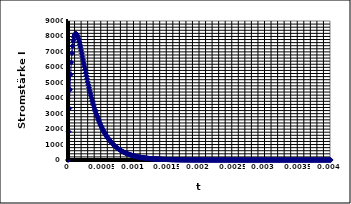
| Category | Series 0 |
|---|---|
| 0.0 | 0 |
| 1e-05 | 1835 |
| 2e-05 | 3338.369 |
| 3.0000000000000004e-05 | 4559.439 |
| 4e-05 | 5540.54 |
| 5e-05 | 6317.987 |
| 6e-05 | 6922.914 |
| 7.000000000000001e-05 | 7382.01 |
| 8e-05 | 7718.133 |
| 9e-05 | 7950.855 |
| 0.0001 | 8096.922 |
| 0.00011 | 8170.649 |
| 0.00012 | 8184.266 |
| 0.00013000000000000002 | 8148.21 |
| 0.00014000000000000001 | 8071.38 |
| 0.00015000000000000001 | 7961.353 |
| 0.00016 | 7824.573 |
| 0.00017 | 7666.509 |
| 0.00018 | 7491.8 |
| 0.00019 | 7304.367 |
| 0.0002 | 7107.518 |
| 0.00021 | 6904.039 |
| 0.00022 | 6696.264 |
| 0.00023 | 6486.147 |
| 0.00024 | 6275.311 |
| 0.00025 | 6065.1 |
| 0.00026000000000000003 | 5856.619 |
| 0.00027000000000000006 | 5650.771 |
| 0.0002800000000000001 | 5448.283 |
| 0.0002900000000000001 | 5249.739 |
| 0.00030000000000000014 | 5055.596 |
| 0.00031000000000000016 | 4866.205 |
| 0.0003200000000000002 | 4681.83 |
| 0.0003300000000000002 | 4502.658 |
| 0.00034000000000000024 | 4328.814 |
| 0.00035000000000000027 | 4160.371 |
| 0.0003600000000000003 | 3997.357 |
| 0.0003700000000000003 | 3839.764 |
| 0.00038000000000000035 | 3687.554 |
| 0.00039000000000000037 | 3540.666 |
| 0.0004000000000000004 | 3399.017 |
| 0.0004100000000000004 | 3262.508 |
| 0.00042000000000000045 | 3131.03 |
| 0.0004300000000000005 | 3004.462 |
| 0.0004400000000000005 | 2882.676 |
| 0.00045000000000000053 | 2765.54 |
| 0.00046000000000000056 | 2652.916 |
| 0.0004700000000000006 | 2544.666 |
| 0.0004800000000000006 | 2440.651 |
| 0.0004900000000000006 | 2340.73 |
| 0.0005000000000000007 | 2244.765 |
| 0.0005100000000000007 | 2152.618 |
| 0.0005200000000000007 | 2064.154 |
| 0.0005300000000000007 | 1979.239 |
| 0.0005400000000000008 | 1897.743 |
| 0.0005500000000000008 | 1819.539 |
| 0.0005600000000000008 | 1744.503 |
| 0.0005700000000000008 | 1672.514 |
| 0.0005800000000000009 | 1603.455 |
| 0.0005900000000000009 | 1537.213 |
| 0.0006000000000000009 | 1473.677 |
| 0.000610000000000001 | 1412.742 |
| 0.000620000000000001 | 1354.304 |
| 0.000630000000000001 | 1298.264 |
| 0.000640000000000001 | 1244.526 |
| 0.0006500000000000011 | 1192.999 |
| 0.0006600000000000011 | 1143.592 |
| 0.0006700000000000011 | 1096.221 |
| 0.0006800000000000011 | 1050.804 |
| 0.0006900000000000012 | 1007.26 |
| 0.0007000000000000012 | 965.514 |
| 0.0007100000000000012 | 925.493 |
| 0.0007200000000000012 | 887.125 |
| 0.0007300000000000013 | 850.344 |
| 0.0007400000000000013 | 815.084 |
| 0.0007500000000000013 | 781.282 |
| 0.0007600000000000013 | 748.88 |
| 0.0007700000000000014 | 717.82 |
| 0.0007800000000000014 | 688.045 |
| 0.0007900000000000014 | 659.504 |
| 0.0008000000000000014 | 632.145 |
| 0.0008100000000000015 | 605.92 |
| 0.0008200000000000015 | 580.782 |
| 0.0008300000000000015 | 556.686 |
| 0.0008400000000000016 | 533.589 |
| 0.0008500000000000016 | 511.449 |
| 0.0008600000000000016 | 490.227 |
| 0.0008700000000000016 | 469.886 |
| 0.0008800000000000017 | 450.388 |
| 0.0008900000000000017 | 431.698 |
| 0.0009000000000000017 | 413.784 |
| 0.0009100000000000017 | 396.613 |
| 0.0009200000000000018 | 380.154 |
| 0.0009300000000000018 | 364.378 |
| 0.0009400000000000018 | 349.257 |
| 0.0009500000000000018 | 334.763 |
| 0.0009600000000000019 | 320.87 |
| 0.0009700000000000019 | 307.554 |
| 0.000980000000000002 | 294.79 |
| 0.000990000000000002 | 282.556 |
| 0.001000000000000002 | 270.83 |
| 0.001010000000000002 | 259.59 |
| 0.001020000000000002 | 248.816 |
| 0.001030000000000002 | 238.49 |
| 0.001040000000000002 | 228.592 |
| 0.001050000000000002 | 219.105 |
| 0.0010600000000000021 | 210.012 |
| 0.0010700000000000022 | 201.295 |
| 0.0010800000000000022 | 192.941 |
| 0.0010900000000000022 | 184.934 |
| 0.0011000000000000022 | 177.258 |
| 0.0011100000000000023 | 169.902 |
| 0.0011200000000000023 | 162.85 |
| 0.0011300000000000023 | 156.091 |
| 0.0011400000000000023 | 149.613 |
| 0.0011500000000000024 | 143.404 |
| 0.0011600000000000024 | 137.452 |
| 0.0011700000000000024 | 131.747 |
| 0.0011800000000000024 | 126.279 |
| 0.0011900000000000025 | 121.038 |
| 0.0012000000000000025 | 116.015 |
| 0.0012100000000000025 | 111.2 |
| 0.0012200000000000025 | 106.584 |
| 0.0012300000000000026 | 102.161 |
| 0.0012400000000000026 | 97.921 |
| 0.0012500000000000026 | 93.857 |
| 0.0012600000000000027 | 89.961 |
| 0.0012700000000000027 | 86.228 |
| 0.0012800000000000027 | 82.649 |
| 0.0012900000000000027 | 79.219 |
| 0.0013000000000000028 | 75.931 |
| 0.0013100000000000028 | 72.779 |
| 0.0013200000000000028 | 69.759 |
| 0.0013300000000000028 | 66.864 |
| 0.0013400000000000029 | 64.088 |
| 0.0013500000000000029 | 61.429 |
| 0.001360000000000003 | 58.879 |
| 0.001370000000000003 | 56.435 |
| 0.001380000000000003 | 54.093 |
| 0.001390000000000003 | 51.848 |
| 0.001400000000000003 | 49.696 |
| 0.001410000000000003 | 47.634 |
| 0.001420000000000003 | 45.657 |
| 0.001430000000000003 | 43.762 |
| 0.0014400000000000031 | 41.945 |
| 0.0014500000000000032 | 40.204 |
| 0.0014600000000000032 | 38.536 |
| 0.0014700000000000032 | 36.936 |
| 0.0014800000000000032 | 35.403 |
| 0.0014900000000000033 | 33.934 |
| 0.0015000000000000033 | 32.526 |
| 0.0015100000000000033 | 31.176 |
| 0.0015200000000000033 | 29.882 |
| 0.0015300000000000034 | 28.642 |
| 0.0015400000000000034 | 27.453 |
| 0.0015500000000000034 | 26.314 |
| 0.0015600000000000034 | 25.221 |
| 0.0015700000000000035 | 24.175 |
| 0.0015800000000000035 | 23.171 |
| 0.0015900000000000035 | 22.21 |
| 0.0016000000000000035 | 21.288 |
| 0.0016100000000000036 | 20.404 |
| 0.0016200000000000036 | 19.557 |
| 0.0016300000000000036 | 18.746 |
| 0.0016400000000000037 | 17.968 |
| 0.0016500000000000037 | 17.222 |
| 0.0016600000000000037 | 16.507 |
| 0.0016700000000000037 | 15.822 |
| 0.0016800000000000038 | 15.165 |
| 0.0016900000000000038 | 14.536 |
| 0.0017000000000000038 | 13.933 |
| 0.0017100000000000038 | 13.354 |
| 0.0017200000000000039 | 12.8 |
| 0.0017300000000000039 | 12.269 |
| 0.001740000000000004 | 11.76 |
| 0.001750000000000004 | 11.272 |
| 0.001760000000000004 | 10.804 |
| 0.001770000000000004 | 10.355 |
| 0.001780000000000004 | 9.926 |
| 0.001790000000000004 | 9.514 |
| 0.001800000000000004 | 9.119 |
| 0.001810000000000004 | 8.74 |
| 0.0018200000000000041 | 8.378 |
| 0.0018300000000000041 | 8.03 |
| 0.0018400000000000042 | 7.697 |
| 0.0018500000000000042 | 7.377 |
| 0.0018600000000000042 | 7.071 |
| 0.0018700000000000043 | 6.778 |
| 0.0018800000000000043 | 6.496 |
| 0.0018900000000000043 | 6.227 |
| 0.0019000000000000043 | 5.968 |
| 0.0019100000000000044 | 5.721 |
| 0.0019200000000000044 | 5.483 |
| 0.0019300000000000044 | 5.256 |
| 0.0019400000000000044 | 5.037 |
| 0.0019500000000000045 | 4.828 |
| 0.0019600000000000043 | 4.628 |
| 0.0019700000000000043 | 4.436 |
| 0.0019800000000000043 | 4.252 |
| 0.0019900000000000044 | 4.075 |
| 0.0020000000000000044 | 3.906 |
| 0.0020100000000000044 | 3.744 |
| 0.0020200000000000044 | 3.589 |
| 0.0020300000000000045 | 3.44 |
| 0.0020400000000000045 | 3.297 |
| 0.0020500000000000045 | 3.16 |
| 0.0020600000000000045 | 3.029 |
| 0.0020700000000000046 | 2.903 |
| 0.0020800000000000046 | 2.783 |
| 0.0020900000000000046 | 2.667 |
| 0.0021000000000000046 | 2.557 |
| 0.0021100000000000047 | 2.45 |
| 0.0021200000000000047 | 2.349 |
| 0.0021300000000000047 | 2.251 |
| 0.0021400000000000047 | 2.158 |
| 0.0021500000000000048 | 2.068 |
| 0.002160000000000005 | 1.982 |
| 0.002170000000000005 | 1.9 |
| 0.002180000000000005 | 1.821 |
| 0.002190000000000005 | 1.746 |
| 0.002200000000000005 | 1.673 |
| 0.002210000000000005 | 1.604 |
| 0.002220000000000005 | 1.537 |
| 0.002230000000000005 | 1.473 |
| 0.002240000000000005 | 1.412 |
| 0.002250000000000005 | 1.354 |
| 0.002260000000000005 | 1.297 |
| 0.002270000000000005 | 1.244 |
| 0.002280000000000005 | 1.192 |
| 0.002290000000000005 | 1.143 |
| 0.002300000000000005 | 1.095 |
| 0.002310000000000005 | 1.05 |
| 0.0023200000000000052 | 1.006 |
| 0.0023300000000000052 | 0.964 |
| 0.0023400000000000053 | 0.924 |
| 0.0023500000000000053 | 0.886 |
| 0.0023600000000000053 | 0.849 |
| 0.0023700000000000053 | 0.814 |
| 0.0023800000000000054 | 0.78 |
| 0.0023900000000000054 | 0.748 |
| 0.0024000000000000054 | 0.717 |
| 0.0024100000000000055 | 0.687 |
| 0.0024200000000000055 | 0.658 |
| 0.0024300000000000055 | 0.631 |
| 0.0024400000000000055 | 0.605 |
| 0.0024500000000000056 | 0.58 |
| 0.0024600000000000056 | 0.556 |
| 0.0024700000000000056 | 0.533 |
| 0.0024800000000000056 | 0.511 |
| 0.0024900000000000057 | 0.489 |
| 0.0025000000000000057 | 0.469 |
| 0.0025100000000000057 | 0.45 |
| 0.0025200000000000057 | 0.431 |
| 0.0025300000000000058 | 0.413 |
| 0.002540000000000006 | 0.396 |
| 0.002550000000000006 | 0.38 |
| 0.002560000000000006 | 0.364 |
| 0.002570000000000006 | 0.349 |
| 0.002580000000000006 | 0.334 |
| 0.002590000000000006 | 0.32 |
| 0.002600000000000006 | 0.307 |
| 0.002610000000000006 | 0.294 |
| 0.002620000000000006 | 0.282 |
| 0.002630000000000006 | 0.27 |
| 0.002640000000000006 | 0.259 |
| 0.002650000000000006 | 0.248 |
| 0.002660000000000006 | 0.238 |
| 0.002670000000000006 | 0.228 |
| 0.002680000000000006 | 0.219 |
| 0.002690000000000006 | 0.21 |
| 0.002700000000000006 | 0.201 |
| 0.0027100000000000062 | 0.193 |
| 0.0027200000000000063 | 0.185 |
| 0.0027300000000000063 | 0.177 |
| 0.0027400000000000063 | 0.17 |
| 0.0027500000000000063 | 0.163 |
| 0.0027600000000000064 | 0.156 |
| 0.0027700000000000064 | 0.149 |
| 0.0027800000000000064 | 0.143 |
| 0.0027900000000000065 | 0.137 |
| 0.0028000000000000065 | 0.132 |
| 0.0028100000000000065 | 0.126 |
| 0.0028200000000000065 | 0.121 |
| 0.0028300000000000066 | 0.116 |
| 0.0028400000000000066 | 0.111 |
| 0.0028500000000000066 | 0.106 |
| 0.0028600000000000066 | 0.102 |
| 0.0028700000000000067 | 0.098 |
| 0.0028800000000000067 | 0.094 |
| 0.0028900000000000067 | 0.09 |
| 0.0029000000000000067 | 0.086 |
| 0.0029100000000000068 | 0.083 |
| 0.002920000000000007 | 0.079 |
| 0.002930000000000007 | 0.076 |
| 0.002940000000000007 | 0.073 |
| 0.002950000000000007 | 0.07 |
| 0.002960000000000007 | 0.067 |
| 0.002970000000000007 | 0.064 |
| 0.002980000000000007 | 0.061 |
| 0.002990000000000007 | 0.059 |
| 0.003000000000000007 | 0.056 |
| 0.003010000000000007 | 0.054 |
| 0.003020000000000007 | 0.052 |
| 0.003030000000000007 | 0.05 |
| 0.003040000000000007 | 0.048 |
| 0.003050000000000007 | 0.046 |
| 0.003060000000000007 | 0.044 |
| 0.003070000000000007 | 0.042 |
| 0.003080000000000007 | 0.04 |
| 0.0030900000000000072 | 0.038 |
| 0.0031000000000000073 | 0.037 |
| 0.0031100000000000073 | 0.035 |
| 0.0031200000000000073 | 0.034 |
| 0.0031300000000000073 | 0.032 |
| 0.0031400000000000074 | 0.031 |
| 0.0031500000000000074 | 0.03 |
| 0.0031600000000000074 | 0.029 |
| 0.0031700000000000074 | 0.027 |
| 0.0031800000000000075 | 0.026 |
| 0.0031900000000000075 | 0.025 |
| 0.0032000000000000075 | 0.024 |
| 0.0032100000000000076 | 0.023 |
| 0.0032200000000000076 | 0.022 |
| 0.0032300000000000076 | 0.021 |
| 0.0032400000000000076 | 0.02 |
| 0.0032500000000000077 | 0.02 |
| 0.0032600000000000077 | 0.019 |
| 0.0032700000000000077 | 0.018 |
| 0.0032800000000000077 | 0.017 |
| 0.0032900000000000078 | 0.016 |
| 0.003300000000000008 | 0.016 |
| 0.003310000000000008 | 0.015 |
| 0.003320000000000008 | 0.015 |
| 0.003330000000000008 | 0.014 |
| 0.003340000000000008 | 0.013 |
| 0.003350000000000008 | 0.013 |
| 0.003360000000000008 | 0.012 |
| 0.003370000000000008 | 0.012 |
| 0.003380000000000008 | 0.011 |
| 0.003390000000000008 | 0.011 |
| 0.003400000000000008 | 0.01 |
| 0.003410000000000008 | 0.01 |
| 0.003420000000000008 | 0.009 |
| 0.003430000000000008 | 0.009 |
| 0.003440000000000008 | 0.009 |
| 0.003450000000000008 | 0.008 |
| 0.003460000000000008 | 0.008 |
| 0.0034700000000000082 | 0.008 |
| 0.0034800000000000083 | 0.007 |
| 0.0034900000000000083 | 0.007 |
| 0.0035000000000000083 | 0.007 |
| 0.0035100000000000083 | 0.006 |
| 0.0035200000000000084 | 0.006 |
| 0.0035300000000000084 | 0.006 |
| 0.0035400000000000084 | 0.006 |
| 0.0035500000000000084 | 0.005 |
| 0.0035600000000000085 | 0.005 |
| 0.0035700000000000085 | 0.005 |
| 0.0035800000000000085 | 0.005 |
| 0.0035900000000000085 | 0.005 |
| 0.0036000000000000086 | 0.004 |
| 0.0036100000000000086 | 0.004 |
| 0.0036200000000000086 | 0.004 |
| 0.0036300000000000087 | 0.004 |
| 0.0036400000000000087 | 0.004 |
| 0.0036500000000000087 | 0.004 |
| 0.0036600000000000087 | 0.003 |
| 0.0036700000000000088 | 0.003 |
| 0.003680000000000009 | 0.003 |
| 0.003690000000000009 | 0.003 |
| 0.003700000000000009 | 0.003 |
| 0.003710000000000009 | 0.003 |
| 0.003720000000000009 | 0.003 |
| 0.003730000000000009 | 0.003 |
| 0.003740000000000009 | 0.002 |
| 0.003750000000000009 | 0.002 |
| 0.003760000000000009 | 0.002 |
| 0.003770000000000009 | 0.002 |
| 0.003780000000000009 | 0.002 |
| 0.003790000000000009 | 0.002 |
| 0.003800000000000009 | 0.002 |
| 0.003810000000000009 | 0.002 |
| 0.003820000000000009 | 0.002 |
| 0.003830000000000009 | 0.002 |
| 0.003840000000000009 | 0.002 |
| 0.0038500000000000092 | 0.002 |
| 0.0038600000000000093 | 0.001 |
| 0.0038700000000000093 | 0.001 |
| 0.0038800000000000093 | 0.001 |
| 0.0038900000000000093 | 0.001 |
| 0.0039000000000000094 | 0.001 |
| 0.003910000000000009 | 0.001 |
| 0.0039200000000000085 | 0.001 |
| 0.003930000000000008 | 0.001 |
| 0.003940000000000008 | 0.001 |
| 0.003950000000000007 | 0.001 |
| 0.003960000000000007 | 0.001 |
| 0.0039700000000000065 | 0.001 |
| 0.003980000000000006 | 0.001 |
| 0.003990000000000006 | 0.001 |
| 0.004000000000000005 | 0.001 |
| 0.004010000000000005 | 0.001 |
| 0.0040200000000000045 | 0.001 |
| 0.004030000000000004 | 0.001 |
| 0.004040000000000004 | 0.001 |
| 0.004050000000000003 | 0.001 |
| 0.004060000000000003 | 0.001 |
| 0.0040700000000000024 | 0.001 |
| 0.004080000000000002 | 0.001 |
| 0.004090000000000002 | 0.001 |
| 0.004100000000000001 | 0.001 |
| 0.004110000000000001 | 0.001 |
| 0.00412 | 0 |
| 0.00413 | 0 |
| 0.00414 | 0 |
| 0.004149999999999999 | 0 |
| 0.004159999999999999 | 0 |
| 0.004169999999999998 | 0 |
| 0.004179999999999998 | 0 |
| 0.0041899999999999975 | 0 |
| 0.004199999999999997 | 0 |
| 0.004209999999999997 | 0 |
| 0.004219999999999996 | 0 |
| 0.004229999999999996 | 0 |
| 0.0042399999999999955 | 0 |
| 0.004249999999999995 | 0 |
| 0.004259999999999995 | 0 |
| 0.004269999999999994 | 0 |
| 0.004279999999999994 | 0 |
| 0.0042899999999999935 | 0 |
| 0.004299999999999993 | 0 |
| 0.004309999999999993 | 0 |
| 0.004319999999999992 | 0 |
| 0.004329999999999992 | 0 |
| 0.0043399999999999914 | 0 |
| 0.004349999999999991 | 0 |
| 0.004359999999999991 | 0 |
| 0.00436999999999999 | 0 |
| 0.00437999999999999 | 0 |
| 0.004389999999999989 | 0 |
| 0.004399999999999989 | 0 |
| 0.004409999999999989 | 0 |
| 0.004419999999999988 | 0 |
| 0.004429999999999988 | 0 |
| 0.004439999999999987 | 0 |
| 0.004449999999999987 | 0 |
| 0.0044599999999999865 | 0 |
| 0.004469999999999986 | 0 |
| 0.004479999999999986 | 0 |
| 0.004489999999999985 | 0 |
| 0.004499999999999985 | 0 |
| 0.0045099999999999845 | 0 |
| 0.004519999999999984 | 0 |
| 0.004529999999999984 | 0 |
| 0.004539999999999983 | 0 |
| 0.004549999999999983 | 0 |
| 0.0045599999999999825 | 0 |
| 0.004569999999999982 | 0 |
| 0.004579999999999982 | 0 |
| 0.004589999999999981 | 0 |
| 0.004599999999999981 | 0 |
| 0.00460999999999998 | 0 |
| 0.00461999999999998 | 0 |
| 0.00462999999999998 | 0 |
| 0.004639999999999979 | 0 |
| 0.004649999999999979 | 0 |
| 0.004659999999999978 | 0 |
| 0.004669999999999978 | 0 |
| 0.004679999999999978 | 0 |
| 0.004689999999999977 | 0 |
| 0.004699999999999977 | 0 |
| 0.004709999999999976 | 0 |
| 0.004719999999999976 | 0 |
| 0.0047299999999999755 | 0 |
| 0.004739999999999975 | 0 |
| 0.004749999999999975 | 0 |
| 0.004759999999999974 | 0 |
| 0.004769999999999974 | 0 |
| 0.0047799999999999735 | 0 |
| 0.004789999999999973 | 0 |
| 0.004799999999999973 | 0 |
| 0.004809999999999972 | 0 |
| 0.004819999999999972 | 0 |
| 0.0048299999999999715 | 0 |
| 0.004839999999999971 | 0 |
| 0.004849999999999971 | 0 |
| 0.00485999999999997 | 0 |
| 0.00486999999999997 | 0 |
| 0.004879999999999969 | 0 |
| 0.004889999999999969 | 0 |
| 0.004899999999999969 | 0 |
| 0.004909999999999968 | 0 |
| 0.004919999999999968 | 0 |
| 0.004929999999999967 | 0 |
| 0.004939999999999967 | 0 |
| 0.004949999999999967 | 0 |
| 0.004959999999999966 | 0 |
| 0.004969999999999966 | 0 |
| 0.004979999999999965 | 0 |
| 0.004989999999999965 | 0 |
| 0.0049999999999999645 | 0 |
| 0.005009999999999964 | 0 |
| 0.005019999999999964 | 0 |
| 0.005029999999999963 | 0 |
| 0.005039999999999963 | 0 |
| 0.0050499999999999625 | 0 |
| 0.005059999999999962 | 0 |
| 0.005069999999999962 | 0 |
| 0.005079999999999961 | 0 |
| 0.005089999999999961 | 0 |
| 0.0050999999999999605 | 0 |
| 0.00510999999999996 | 0 |
| 0.00511999999999996 | 0 |
| 0.005129999999999959 | 0 |
| 0.005139999999999959 | 0 |
| 0.005149999999999958 | 0 |
| 0.005159999999999958 | 0 |
| 0.005169999999999958 | 0 |
| 0.005179999999999957 | 0 |
| 0.005189999999999957 | 0 |
| 0.005199999999999956 | 0 |
| 0.005209999999999956 | 0 |
| 0.005219999999999956 | 0 |
| 0.005229999999999955 | 0 |
| 0.005239999999999955 | 0 |
| 0.005249999999999954 | 0 |
| 0.005259999999999954 | 0 |
| 0.0052699999999999535 | 0 |
| 0.005279999999999953 | 0 |
| 0.005289999999999953 | 0 |
| 0.005299999999999952 | 0 |
| 0.005309999999999952 | 0 |
| 0.0053199999999999515 | 0 |
| 0.005329999999999951 | 0 |
| 0.005339999999999951 | 0 |
| 0.00534999999999995 | 0 |
| 0.00535999999999995 | 0 |
| 0.0053699999999999495 | 0 |
| 0.005379999999999949 | 0 |
| 0.005389999999999949 | 0 |
| 0.005399999999999948 | 0 |
| 0.005409999999999948 | 0 |
| 0.005419999999999947 | 0 |
| 0.005429999999999947 | 0 |
| 0.005439999999999947 | 0 |
| 0.005449999999999946 | 0 |
| 0.005459999999999946 | 0 |
| 0.005469999999999945 | 0 |
| 0.005479999999999945 | 0 |
| 0.005489999999999945 | 0 |
| 0.005499999999999944 | 0 |
| 0.005509999999999944 | 0 |
| 0.005519999999999943 | 0 |
| 0.005529999999999943 | 0 |
| 0.0055399999999999425 | 0 |
| 0.005549999999999942 | 0 |
| 0.005559999999999942 | 0 |
| 0.005569999999999941 | 0 |
| 0.005579999999999941 | 0 |
| 0.0055899999999999405 | 0 |
| 0.00559999999999994 | 0 |
| 0.00560999999999994 | 0 |
| 0.005619999999999939 | 0 |
| 0.005629999999999939 | 0 |
| 0.0056399999999999385 | 0 |
| 0.005649999999999938 | 0 |
| 0.005659999999999938 | 0 |
| 0.005669999999999937 | 0 |
| 0.005679999999999937 | 0 |
| 0.005689999999999936 | 0 |
| 0.005699999999999936 | 0 |
| 0.005709999999999936 | 0 |
| 0.005719999999999935 | 0 |
| 0.005729999999999935 | 0 |
| 0.005739999999999934 | 0 |
| 0.005749999999999934 | 0 |
| 0.005759999999999934 | 0 |
| 0.005769999999999933 | 0 |
| 0.005779999999999933 | 0 |
| 0.005789999999999932 | 0 |
| 0.005799999999999932 | 0 |
| 0.0058099999999999315 | 0 |
| 0.005819999999999931 | 0 |
| 0.005829999999999931 | 0 |
| 0.00583999999999993 | 0 |
| 0.00584999999999993 | 0 |
| 0.0058599999999999295 | 0 |
| 0.005869999999999929 | 0 |
| 0.005879999999999929 | 0 |
| 0.005889999999999928 | 0 |
| 0.005899999999999928 | 0 |
| 0.0059099999999999275 | 0 |
| 0.005919999999999927 | 0 |
| 0.005929999999999927 | 0 |
| 0.005939999999999926 | 0 |
| 0.005949999999999926 | 0 |
| 0.005959999999999925 | 0 |
| 0.005969999999999925 | 0 |
| 0.005979999999999925 | 0 |
| 0.005989999999999924 | 0 |
| 0.005999999999999924 | 0 |
| 0.006009999999999923 | 0 |
| 0.006019999999999923 | 0 |
| 0.006029999999999923 | 0 |
| 0.006039999999999922 | 0 |
| 0.006049999999999922 | 0 |
| 0.006059999999999921 | 0 |
| 0.006069999999999921 | 0 |
| 0.0060799999999999205 | 0 |
| 0.00608999999999992 | 0 |
| 0.00609999999999992 | 0 |
| 0.006109999999999919 | 0 |
| 0.006119999999999919 | 0 |
| 0.0061299999999999185 | 0 |
| 0.006139999999999918 | 0 |
| 0.006149999999999918 | 0 |
| 0.006159999999999917 | 0 |
| 0.006169999999999917 | 0 |
| 0.0061799999999999165 | 0 |
| 0.006189999999999916 | 0 |
| 0.006199999999999916 | 0 |
| 0.006209999999999915 | 0 |
| 0.006219999999999915 | 0 |
| 0.006229999999999914 | 0 |
| 0.006239999999999914 | 0 |
| 0.006249999999999914 | 0 |
| 0.006259999999999913 | 0 |
| 0.006269999999999913 | 0 |
| 0.006279999999999912 | 0 |
| 0.006289999999999912 | 0 |
| 0.006299999999999912 | 0 |
| 0.006309999999999911 | 0 |
| 0.006319999999999911 | 0 |
| 0.00632999999999991 | 0 |
| 0.00633999999999991 | 0 |
| 0.0063499999999999095 | 0 |
| 0.006359999999999909 | 0 |
| 0.006369999999999909 | 0 |
| 0.006379999999999908 | 0 |
| 0.006389999999999908 | 0 |
| 0.0063999999999999075 | 0 |
| 0.006409999999999907 | 0 |
| 0.006419999999999907 | 0 |
| 0.006429999999999906 | 0 |
| 0.006439999999999906 | 0 |
| 0.0064499999999999055 | 0 |
| 0.006459999999999905 | 0 |
| 0.006469999999999905 | 0 |
| 0.006479999999999904 | 0 |
| 0.006489999999999904 | 0 |
| 0.006499999999999903 | 0 |
| 0.006509999999999903 | 0 |
| 0.006519999999999903 | 0 |
| 0.006529999999999902 | 0 |
| 0.006539999999999902 | 0 |
| 0.006549999999999901 | 0 |
| 0.006559999999999901 | 0 |
| 0.006569999999999901 | 0 |
| 0.0065799999999999 | 0 |
| 0.0065899999999999 | 0 |
| 0.006599999999999899 | 0 |
| 0.006609999999999899 | 0 |
| 0.0066199999999998985 | 0 |
| 0.006629999999999898 | 0 |
| 0.006639999999999898 | 0 |
| 0.006649999999999897 | 0 |
| 0.006659999999999897 | 0 |
| 0.0066699999999998965 | 0 |
| 0.006679999999999896 | 0 |
| 0.006689999999999896 | 0 |
| 0.006699999999999895 | 0 |
| 0.006709999999999895 | 0 |
| 0.0067199999999998945 | 0 |
| 0.006729999999999894 | 0 |
| 0.006739999999999894 | 0 |
| 0.006749999999999893 | 0 |
| 0.006759999999999893 | 0 |
| 0.006769999999999892 | 0 |
| 0.006779999999999892 | 0 |
| 0.006789999999999892 | 0 |
| 0.006799999999999891 | 0 |
| 0.006809999999999891 | 0 |
| 0.00681999999999989 | 0 |
| 0.00682999999999989 | 0 |
| 0.00683999999999989 | 0 |
| 0.006849999999999889 | 0 |
| 0.006859999999999889 | 0 |
| 0.006869999999999888 | 0 |
| 0.006879999999999888 | 0 |
| 0.0068899999999998875 | 0 |
| 0.006899999999999887 | 0 |
| 0.006909999999999887 | 0 |
| 0.006919999999999886 | 0 |
| 0.006929999999999886 | 0 |
| 0.0069399999999998855 | 0 |
| 0.006949999999999885 | 0 |
| 0.006959999999999885 | 0 |
| 0.006969999999999884 | 0 |
| 0.006979999999999884 | 0 |
| 0.0069899999999998835 | 0 |
| 0.006999999999999883 | 0 |
| 0.007009999999999883 | 0 |
| 0.007019999999999882 | 0 |
| 0.007029999999999882 | 0 |
| 0.007039999999999881 | 0 |
| 0.007049999999999881 | 0 |
| 0.007059999999999881 | 0 |
| 0.00706999999999988 | 0 |
| 0.00707999999999988 | 0 |
| 0.007089999999999879 | 0 |
| 0.007099999999999879 | 0 |
| 0.007109999999999879 | 0 |
| 0.007119999999999878 | 0 |
| 0.007129999999999878 | 0 |
| 0.007139999999999877 | 0 |
| 0.007149999999999877 | 0 |
| 0.0071599999999998765 | 0 |
| 0.007169999999999876 | 0 |
| 0.007179999999999876 | 0 |
| 0.007189999999999875 | 0 |
| 0.007199999999999875 | 0 |
| 0.0072099999999998745 | 0 |
| 0.007219999999999874 | 0 |
| 0.007229999999999874 | 0 |
| 0.007239999999999873 | 0 |
| 0.007249999999999873 | 0 |
| 0.0072599999999998725 | 0 |
| 0.007269999999999872 | 0 |
| 0.007279999999999872 | 0 |
| 0.007289999999999871 | 0 |
| 0.007299999999999871 | 0 |
| 0.00730999999999987 | 0 |
| 0.00731999999999987 | 0 |
| 0.00732999999999987 | 0 |
| 0.007339999999999869 | 0 |
| 0.007349999999999869 | 0 |
| 0.007359999999999868 | 0 |
| 0.007369999999999868 | 0 |
| 0.007379999999999868 | 0 |
| 0.007389999999999867 | 0 |
| 0.007399999999999867 | 0 |
| 0.007409999999999866 | 0 |
| 0.007419999999999866 | 0 |
| 0.0074299999999998655 | 0 |
| 0.007439999999999865 | 0 |
| 0.007449999999999865 | 0 |
| 0.007459999999999864 | 0 |
| 0.007469999999999864 | 0 |
| 0.0074799999999998635 | 0 |
| 0.007489999999999863 | 0 |
| 0.007499999999999863 | 0 |
| 0.007509999999999862 | 0 |
| 0.007519999999999862 | 0 |
| 0.0075299999999998615 | 0 |
| 0.007539999999999861 | 0 |
| 0.007549999999999861 | 0 |
| 0.00755999999999986 | 0 |
| 0.00756999999999986 | 0 |
| 0.007579999999999859 | 0 |
| 0.007589999999999859 | 0 |
| 0.007599999999999859 | 0 |
| 0.007609999999999858 | 0 |
| 0.007619999999999858 | 0 |
| 0.007629999999999857 | 0 |
| 0.007639999999999857 | 0 |
| 0.007649999999999857 | 0 |
| 0.007659999999999856 | 0 |
| 0.007669999999999856 | 0 |
| 0.007679999999999855 | 0 |
| 0.007689999999999855 | 0 |
| 0.0076999999999998545 | 0 |
| 0.007709999999999854 | 0 |
| 0.007719999999999854 | 0 |
| 0.007729999999999853 | 0 |
| 0.007739999999999853 | 0 |
| 0.0077499999999998525 | 0 |
| 0.007759999999999852 | 0 |
| 0.007769999999999852 | 0 |
| 0.007779999999999851 | 0 |
| 0.007789999999999851 | 0 |
| 0.0077999999999998505 | 0 |
| 0.00780999999999985 | 0 |
| 0.00781999999999985 | 0 |
| 0.00782999999999985 | 0 |
| 0.007839999999999849 | 0 |
| 0.007849999999999848 | 0 |
| 0.007859999999999848 | 0 |
| 0.007869999999999848 | 0 |
| 0.007879999999999847 | 0 |
| 0.007889999999999847 | 0 |
| 0.007899999999999846 | 0 |
| 0.007909999999999846 | 0 |
| 0.007919999999999846 | 0 |
| 0.007929999999999845 | 0 |
| 0.007939999999999845 | 0 |
| 0.007949999999999844 | 0 |
| 0.007959999999999844 | 0 |
| 0.007969999999999844 | 0 |
| 0.007979999999999843 | 0 |
| 0.007989999999999843 | 0 |
| 0.007999999999999842 | 0 |
| 0.008009999999999842 | 0 |
| 0.008019999999999841 | 0 |
| 0.008029999999999841 | 0 |
| 0.00803999999999984 | 0 |
| 0.00804999999999984 | 0 |
| 0.00805999999999984 | 0 |
| 0.00806999999999984 | 0 |
| 0.008079999999999839 | 0 |
| 0.008089999999999839 | 0 |
| 0.008099999999999838 | 0 |
| 0.008109999999999838 | 0 |
| 0.008119999999999837 | 0 |
| 0.008129999999999837 | 0 |
| 0.008139999999999837 | 0 |
| 0.008149999999999836 | 0 |
| 0.008159999999999836 | 0 |
| 0.008169999999999835 | 0 |
| 0.008179999999999835 | 0 |
| 0.008189999999999835 | 0 |
| 0.008199999999999834 | 0 |
| 0.008209999999999834 | 0 |
| 0.008219999999999833 | 0 |
| 0.008229999999999833 | 0 |
| 0.008239999999999833 | 0 |
| 0.008249999999999832 | 0 |
| 0.008259999999999832 | 0 |
| 0.008269999999999831 | 0 |
| 0.008279999999999831 | 0 |
| 0.00828999999999983 | 0 |
| 0.00829999999999983 | 0 |
| 0.00830999999999983 | 0 |
| 0.00831999999999983 | 0 |
| 0.008329999999999829 | 0 |
| 0.008339999999999828 | 0 |
| 0.008349999999999828 | 0 |
| 0.008359999999999828 | 0 |
| 0.008369999999999827 | 0 |
| 0.008379999999999827 | 0 |
| 0.008389999999999826 | 0 |
| 0.008399999999999826 | 0 |
| 0.008409999999999826 | 0 |
| 0.008419999999999825 | 0 |
| 0.008429999999999825 | 0 |
| 0.008439999999999824 | 0 |
| 0.008449999999999824 | 0 |
| 0.008459999999999824 | 0 |
| 0.008469999999999823 | 0 |
| 0.008479999999999823 | 0 |
| 0.008489999999999822 | 0 |
| 0.008499999999999822 | 0 |
| 0.008509999999999822 | 0 |
| 0.008519999999999821 | 0 |
| 0.00852999999999982 | 0 |
| 0.00853999999999982 | 0 |
| 0.00854999999999982 | 0 |
| 0.00855999999999982 | 0 |
| 0.008569999999999819 | 0 |
| 0.008579999999999819 | 0 |
| 0.008589999999999818 | 0 |
| 0.008599999999999818 | 0 |
| 0.008609999999999817 | 0 |
| 0.008619999999999817 | 0 |
| 0.008629999999999817 | 0 |
| 0.008639999999999816 | 0 |
| 0.008649999999999816 | 0 |
| 0.008659999999999815 | 0 |
| 0.008669999999999815 | 0 |
| 0.008679999999999815 | 0 |
| 0.008689999999999814 | 0 |
| 0.008699999999999814 | 0 |
| 0.008709999999999813 | 0 |
| 0.008719999999999813 | 0 |
| 0.008729999999999813 | 0 |
| 0.008739999999999812 | 0 |
| 0.008749999999999812 | 0 |
| 0.008759999999999811 | 0 |
| 0.008769999999999811 | 0 |
| 0.00877999999999981 | 0 |
| 0.00878999999999981 | 0 |
| 0.00879999999999981 | 0 |
| 0.00880999999999981 | 0 |
| 0.008819999999999809 | 0 |
| 0.008829999999999808 | 0 |
| 0.008839999999999808 | 0 |
| 0.008849999999999808 | 0 |
| 0.008859999999999807 | 0 |
| 0.008869999999999807 | 0 |
| 0.008879999999999806 | 0 |
| 0.008889999999999806 | 0 |
| 0.008899999999999806 | 0 |
| 0.008909999999999805 | 0 |
| 0.008919999999999805 | 0 |
| 0.008929999999999804 | 0 |
| 0.008939999999999804 | 0 |
| 0.008949999999999804 | 0 |
| 0.008959999999999803 | 0 |
| 0.008969999999999803 | 0 |
| 0.008979999999999802 | 0 |
| 0.008989999999999802 | 0 |
| 0.008999999999999802 | 0 |
| 0.009009999999999801 | 0 |
| 0.0090199999999998 | 0 |
| 0.0090299999999998 | 0 |
| 0.0090399999999998 | 0 |
| 0.0090499999999998 | 0 |
| 0.009059999999999799 | 0 |
| 0.009069999999999799 | 0 |
| 0.009079999999999798 | 0 |
| 0.009089999999999798 | 0 |
| 0.009099999999999797 | 0 |
| 0.009109999999999797 | 0 |
| 0.009119999999999797 | 0 |
| 0.009129999999999796 | 0 |
| 0.009139999999999796 | 0 |
| 0.009149999999999795 | 0 |
| 0.009159999999999795 | 0 |
| 0.009169999999999795 | 0 |
| 0.009179999999999794 | 0 |
| 0.009189999999999794 | 0 |
| 0.009199999999999793 | 0 |
| 0.009209999999999793 | 0 |
| 0.009219999999999793 | 0 |
| 0.009229999999999792 | 0 |
| 0.009239999999999792 | 0 |
| 0.009249999999999791 | 0 |
| 0.009259999999999791 | 0 |
| 0.00926999999999979 | 0 |
| 0.00927999999999979 | 0 |
| 0.00928999999999979 | 0 |
| 0.00929999999999979 | 0 |
| 0.009309999999999789 | 0 |
| 0.009319999999999789 | 0 |
| 0.009329999999999788 | 0 |
| 0.009339999999999788 | 0 |
| 0.009349999999999787 | 0 |
| 0.009359999999999787 | 0 |
| 0.009369999999999786 | 0 |
| 0.009379999999999786 | 0 |
| 0.009389999999999786 | 0 |
| 0.009399999999999785 | 0 |
| 0.009409999999999785 | 0 |
| 0.009419999999999784 | 0 |
| 0.009429999999999784 | 0 |
| 0.009439999999999784 | 0 |
| 0.009449999999999783 | 0 |
| 0.009459999999999783 | 0 |
| 0.009469999999999782 | 0 |
| 0.009479999999999782 | 0 |
| 0.009489999999999782 | 0 |
| 0.009499999999999781 | 0 |
| 0.00950999999999978 | 0 |
| 0.00951999999999978 | 0 |
| 0.00952999999999978 | 0 |
| 0.00953999999999978 | 0 |
| 0.00954999999999978 | 0 |
| 0.009559999999999779 | 0 |
| 0.009569999999999778 | 0 |
| 0.009579999999999778 | 0 |
| 0.009589999999999778 | 0 |
| 0.009599999999999777 | 0 |
| 0.009609999999999777 | 0 |
| 0.009619999999999776 | 0 |
| 0.009629999999999776 | 0 |
| 0.009639999999999775 | 0 |
| 0.009649999999999775 | 0 |
| 0.009659999999999775 | 0 |
| 0.009669999999999774 | 0 |
| 0.009679999999999774 | 0 |
| 0.009689999999999773 | 0 |
| 0.009699999999999773 | 0 |
| 0.009709999999999773 | 0 |
| 0.009719999999999772 | 0 |
| 0.009729999999999772 | 0 |
| 0.009739999999999771 | 0 |
| 0.009749999999999771 | 0 |
| 0.00975999999999977 | 0 |
| 0.00976999999999977 | 0 |
| 0.00977999999999977 | 0 |
| 0.00978999999999977 | 0 |
| 0.009799999999999769 | 0 |
| 0.009809999999999769 | 0 |
| 0.009819999999999768 | 0 |
| 0.009829999999999768 | 0 |
| 0.009839999999999767 | 0 |
| 0.009849999999999767 | 0 |
| 0.009859999999999767 | 0 |
| 0.009869999999999766 | 0 |
| 0.009879999999999766 | 0 |
| 0.009889999999999765 | 0 |
| 0.009899999999999765 | 0 |
| 0.009909999999999764 | 0 |
| 0.009919999999999764 | 0 |
| 0.009929999999999764 | 0 |
| 0.009939999999999763 | 0 |
| 0.009949999999999763 | 0 |
| 0.009959999999999762 | 0 |
| 0.009969999999999762 | 0 |
| 0.009979999999999762 | 0 |
| 0.009989999999999761 | 0 |
| 0.00999999999999976 | 0 |
| 0.01000999999999976 | 0 |
| 0.01001999999999976 | 0 |
| 0.01002999999999976 | 0 |
| 0.01003999999999976 | 0 |
| 0.010049999999999759 | 0 |
| 0.010059999999999758 | 0 |
| 0.010069999999999758 | 0 |
| 0.010079999999999758 | 0 |
| 0.010089999999999757 | 0 |
| 0.010099999999999757 | 0 |
| 0.010109999999999756 | 0 |
| 0.010119999999999756 | 0 |
| 0.010129999999999756 | 0 |
| 0.010139999999999755 | 0 |
| 0.010149999999999755 | 0 |
| 0.010159999999999754 | 0 |
| 0.010169999999999754 | 0 |
| 0.010179999999999753 | 0 |
| 0.010189999999999753 | 0 |
| 0.010199999999999753 | 0 |
| 0.010209999999999752 | 0 |
| 0.010219999999999752 | 0 |
| 0.010229999999999751 | 0 |
| 0.010239999999999751 | 0 |
| 0.01024999999999975 | 0 |
| 0.01025999999999975 | 0 |
| 0.01026999999999975 | 0 |
| 0.01027999999999975 | 0 |
| 0.010289999999999749 | 0 |
| 0.010299999999999749 | 0 |
| 0.010309999999999748 | 0 |
| 0.010319999999999748 | 0 |
| 0.010329999999999747 | 0 |
| 0.010339999999999747 | 0 |
| 0.010349999999999747 | 0 |
| 0.010359999999999746 | 0 |
| 0.010369999999999746 | 0 |
| 0.010379999999999745 | 0 |
| 0.010389999999999745 | 0 |
| 0.010399999999999745 | 0 |
| 0.010409999999999744 | 0 |
| 0.010419999999999744 | 0 |
| 0.010429999999999743 | 0 |
| 0.010439999999999743 | 0 |
| 0.010449999999999742 | 0 |
| 0.010459999999999742 | 0 |
| 0.010469999999999742 | 0 |
| 0.010479999999999741 | 0 |
| 0.01048999999999974 | 0 |
| 0.01049999999999974 | 0 |
| 0.01050999999999974 | 0 |
| 0.01051999999999974 | 0 |
| 0.01052999999999974 | 0 |
| 0.010539999999999739 | 0 |
| 0.010549999999999738 | 0 |
| 0.010559999999999738 | 0 |
| 0.010569999999999738 | 0 |
| 0.010579999999999737 | 0 |
| 0.010589999999999737 | 0 |
| 0.010599999999999736 | 0 |
| 0.010609999999999736 | 0 |
| 0.010619999999999736 | 0 |
| 0.010629999999999735 | 0 |
| 0.010639999999999735 | 0 |
| 0.010649999999999734 | 0 |
| 0.010659999999999734 | 0 |
| 0.010669999999999734 | 0 |
| 0.010679999999999733 | 0 |
| 0.010689999999999733 | 0 |
| 0.010699999999999732 | 0 |
| 0.010709999999999732 | 0 |
| 0.010719999999999731 | 0 |
| 0.010729999999999731 | 0 |
| 0.01073999999999973 | 0 |
| 0.01074999999999973 | 0 |
| 0.01075999999999973 | 0 |
| 0.01076999999999973 | 0 |
| 0.010779999999999729 | 0 |
| 0.010789999999999729 | 0 |
| 0.010799999999999728 | 0 |
| 0.010809999999999728 | 0 |
| 0.010819999999999727 | 0 |
| 0.010829999999999727 | 0 |
| 0.010839999999999727 | 0 |
| 0.010849999999999726 | 0 |
| 0.010859999999999726 | 0 |
| 0.010869999999999725 | 0 |
| 0.010879999999999725 | 0 |
| 0.010889999999999725 | 0 |
| 0.010899999999999724 | 0 |
| 0.010909999999999724 | 0 |
| 0.010919999999999723 | 0 |
| 0.010929999999999723 | 0 |
| 0.010939999999999723 | 0 |
| 0.010949999999999722 | 0 |
| 0.010959999999999722 | 0 |
| 0.010969999999999721 | 0 |
| 0.010979999999999721 | 0 |
| 0.01098999999999972 | 0 |